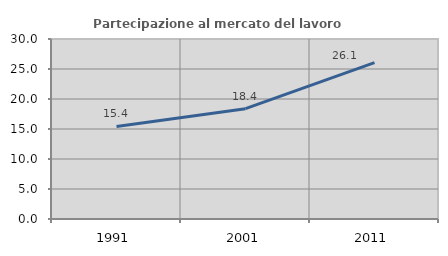
| Category | Partecipazione al mercato del lavoro  femminile |
|---|---|
| 1991.0 | 15.419 |
| 2001.0 | 18.393 |
| 2011.0 | 26.065 |